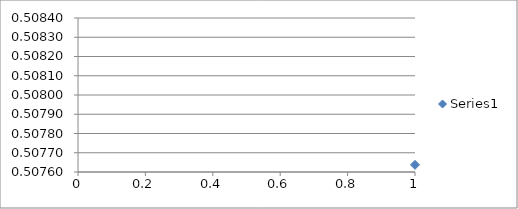
| Category | Series 0 |
|---|---|
| 0 | 0.508 |
| 1 | 0.508 |
| 2 | 0.508 |
| 3 | 0.508 |
| 4 | 0.508 |